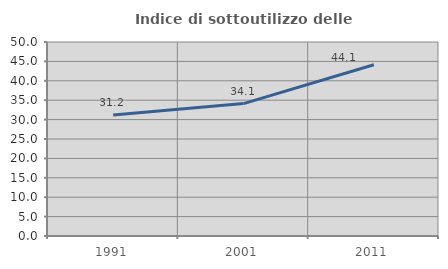
| Category | Indice di sottoutilizzo delle abitazioni  |
|---|---|
| 1991.0 | 31.2 |
| 2001.0 | 34.131 |
| 2011.0 | 44.143 |